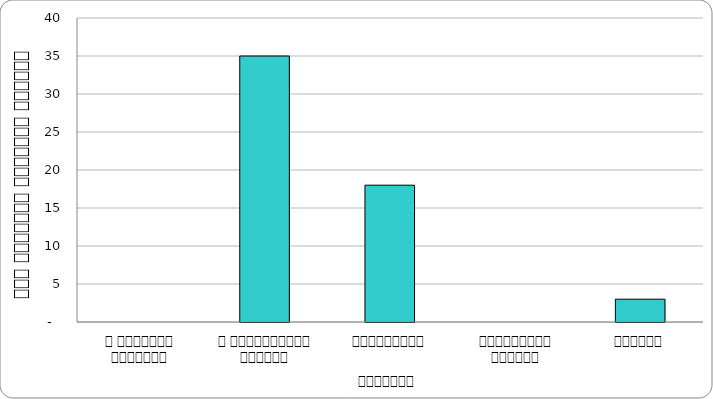
| Category | कुटनीति |
|---|---|
| द हिमालयन टाइम्स् | 0 |
| द काठमाण्डौं पोस्ट् | 35 |
| कान्तिपुर | 18 |
| अन्नपूर्ण पोस्ट् | 0 |
| नागरिक | 3 |